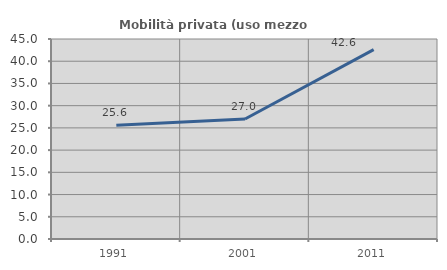
| Category | Mobilità privata (uso mezzo privato) |
|---|---|
| 1991.0 | 25.571 |
| 2001.0 | 26.994 |
| 2011.0 | 42.609 |